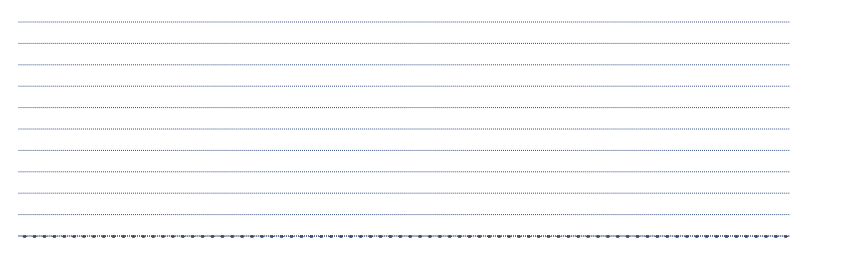
| Category | Series 0 | Series 1 | Series 2 | Series 3 |
|---|---|---|---|---|
| 0.3541666666666667 | 0 | 0 | 0 | 0 |
| 0.3576388888888889 | 0 | 0 | 0 | 0 |
| 0.3611111111111111 | 0 | 0 | 0 | 0 |
| 0.3645833333333333 | 0 | 0 | 0 | 0 |
| 0.3680555555555556 | 0 | 0 | 0 | 0 |
| 0.37152777777777773 | 0 | 0 | 0 | 0 |
| 0.375 | 0 | 0 | 0 | 0 |
| 0.37847222222222227 | 0 | 0 | 0 | 0 |
| 0.3819444444444444 | 0 | 0 | 0 | 0 |
| 0.3854166666666667 | 0 | 0 | 0 | 0 |
| 0.3888888888888889 | 0 | 0 | 0 | 0 |
| 0.3923611111111111 | 0 | 0 | 0 | 0 |
| 0.3958333333333333 | 0 | 0 | 0 | 0 |
| 0.3993055555555556 | 0 | 0 | 0 | 0 |
| 0.40277777777777773 | 0 | 0 | 0 | 0 |
| 0.40625 | 0 | 0 | 0 | 0 |
| 0.40972222222222227 | 0 | 0 | 0 | 0 |
| 0.4131944444444444 | 0 | 0 | 0 | 0 |
| 0.4166666666666667 | 0 | 0 | 0 | 0 |
| 0.4201388888888889 | 0 | 0 | 0 | 0 |
| 0.4236111111111111 | 0 | 0 | 0 | 0 |
| 0.4270833333333333 | 0 | 0 | 0 | 0 |
| 0.4305555555555556 | 0 | 0 | 0 | 0 |
| 0.43402777777777773 | 0 | 0 | 0 | 0 |
| 0.4375 | 0 | 0 | 0 | 0 |
| 0.44097222222222227 | 0 | 0 | 0 | 0 |
| 0.4444444444444444 | 0 | 0 | 0 | 0 |
| 0.4479166666666667 | 0 | 0 | 0 | 0 |
| 0.4513888888888889 | 0 | 0 | 0 | 0 |
| 0.4548611111111111 | 0 | 0 | 0 | 0 |
| 0.4583333333333333 | 0 | 0 | 0 | 0 |
| 0.4618055555555556 | 0 | 0 | 0 | 0 |
| 0.46527777777777773 | 0 | 0 | 0 | 0 |
| 0.46875 | 0 | 0 | 0 | 0 |
| 0.47222222222222227 | 0 | 0 | 0 | 0 |
| 0.4756944444444444 | 0 | 0 | 0 | 0 |
| 0.4791666666666667 | 0 | 0 | 0 | 0 |
| 0.4826388888888889 | 0 | 0 | 0 | 0 |
| 0.4861111111111111 | 0 | 0 | 0 | 0 |
| 0.4895833333333333 | 0 | 0 | 0 | 0 |
| 0.4930555555555556 | 0 | 0 | 0 | 0 |
| 0.49652777777777773 | 0 | 0 | 0 | 0 |
| 0.5 | 0 | 0 | 0 | 0 |
| 0.5034722222222222 | 0 | 0 | 0 | 0 |
| 0.5069444444444444 | 0 | 0 | 0 | 0 |
| 0.5104166666666666 | 0 | 0 | 0 | 0 |
| 0.513888888888889 | 0 | 0 | 0 | 0 |
| 0.517361111111111 | 0 | 0 | 0 | 0 |
| 0.5208333333333334 | 0 | 0 | 0 | 0 |
| 0.5243055555555556 | 0 | 0 | 0 | 0 |
| 0.5277777777777778 | 0 | 0 | 0 | 0 |
| 0.53125 | 0 | 0 | 0 | 0 |
| 0.5347222222222222 | 0 | 0 | 0 | 0 |
| 0.5381944444444444 | 0 | 0 | 0 | 0 |
| 0.5416666666666666 | 0 | 0 | 0 | 0 |
| 0.545138888888889 | 0 | 0 | 0 | 0 |
| 0.548611111111111 | 0 | 0 | 0 | 0 |
| 0.5520833333333334 | 0 | 0 | 0 | 0 |
| 0.5555555555555556 | 0 | 0 | 0 | 0 |
| 0.5590277777777778 | 0 | 0 | 0 | 0 |
| 0.5625 | 0 | 0 | 0 | 0 |
| 0.5659722222222222 | 0 | 0 | 0 | 0 |
| 0.5694444444444444 | 0 | 0 | 0 | 0 |
| 0.5729166666666666 | 0 | 0 | 0 | 0 |
| 0.576388888888889 | 0 | 0 | 0 | 0 |
| 0.579861111111111 | 0 | 0 | 0 | 0 |
| 0.5833333333333334 | 0 | 0 | 0 | 0 |
| 0.5868055555555556 | 0 | 0 | 0 | 0 |
| 0.5902777777777778 | 0 | 0 | 0 | 0 |
| 0.59375 | 0 | 0 | 0 | 0 |
| 0.5972222222222222 | 0 | 0 | 0 | 0 |
| 0.6006944444444444 | 0 | 0 | 0 | 0 |
| 0.6041666666666666 | 0 | 0 | 0 | 0 |
| 0.607638888888889 | 0 | 0 | 0 | 0 |
| 0.611111111111111 | 0 | 0 | 0 | 0 |
| 0.6145833333333334 | 0 | 0 | 0 | 0 |
| 0.6180555555555556 | 0 | 0 | 0 | 0 |
| 0.6215277777777778 | 0 | 0 | 0 | 0 |